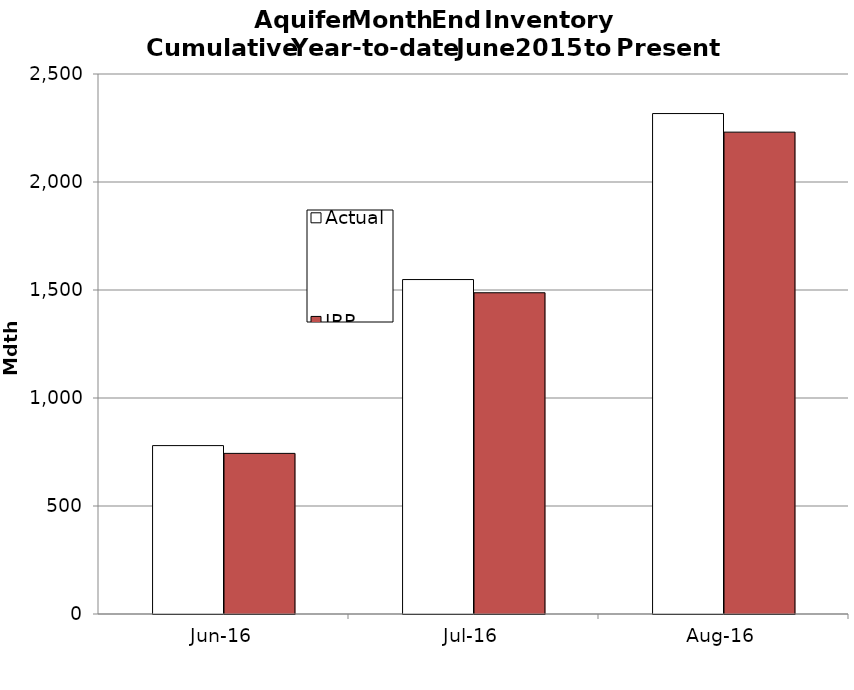
| Category | Actual | IRP Forecast (Normal) |
|---|---|---|
| 2016-06-01 | 779.632 | 743.63 |
| 2016-07-01 | 1548.327 | 1487.26 |
| 2016-08-01 | 2316.877 | 2230.89 |